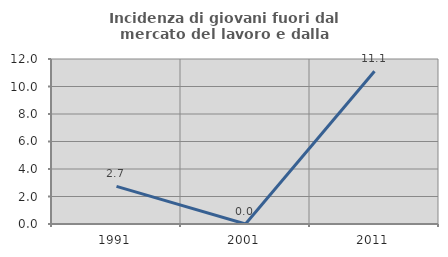
| Category | Incidenza di giovani fuori dal mercato del lavoro e dalla formazione  |
|---|---|
| 1991.0 | 2.74 |
| 2001.0 | 0 |
| 2011.0 | 11.111 |